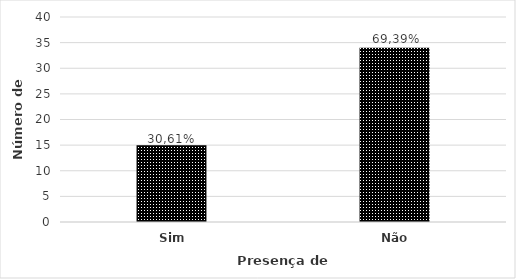
| Category | N° de indíviduos |
|---|---|
| Sim | 15 |
| Não | 34 |